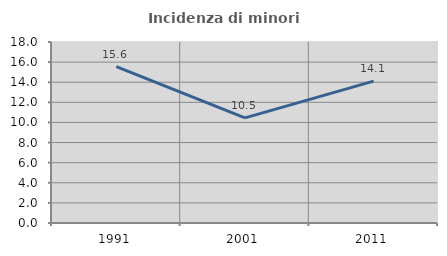
| Category | Incidenza di minori stranieri |
|---|---|
| 1991.0 | 15.556 |
| 2001.0 | 10.458 |
| 2011.0 | 14.106 |